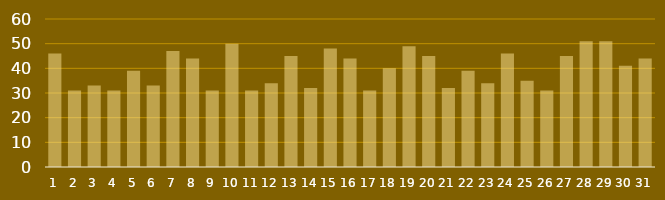
| Category | SQLs |
|---|---|
| 1.0 | 46 |
| 2.0 | 31 |
| 3.0 | 33 |
| 4.0 | 31 |
| 5.0 | 39 |
| 6.0 | 33 |
| 7.0 | 47 |
| 8.0 | 44 |
| 9.0 | 31 |
| 10.0 | 50 |
| 11.0 | 31 |
| 12.0 | 34 |
| 13.0 | 45 |
| 14.0 | 32 |
| 15.0 | 48 |
| 16.0 | 44 |
| 17.0 | 31 |
| 18.0 | 40 |
| 19.0 | 49 |
| 20.0 | 45 |
| 21.0 | 32 |
| 22.0 | 39 |
| 23.0 | 34 |
| 24.0 | 46 |
| 25.0 | 35 |
| 26.0 | 31 |
| 27.0 | 45 |
| 28.0 | 51 |
| 29.0 | 51 |
| 30.0 | 41 |
| 31.0 | 44 |